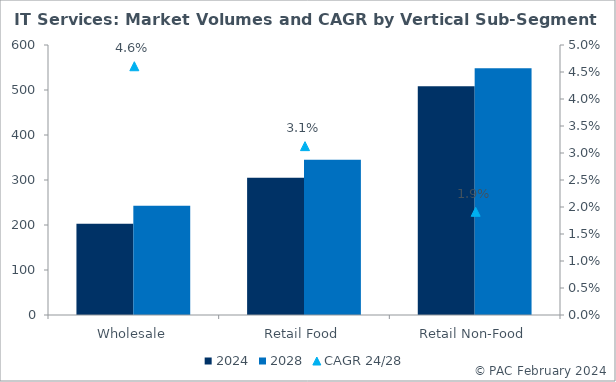
| Category | 2024 | 2028 |
|---|---|---|
| Wholesale | 202.641 | 242.641 |
| Retail Food | 305.169 | 345.169 |
| Retail Non-Food | 508.495 | 548.495 |